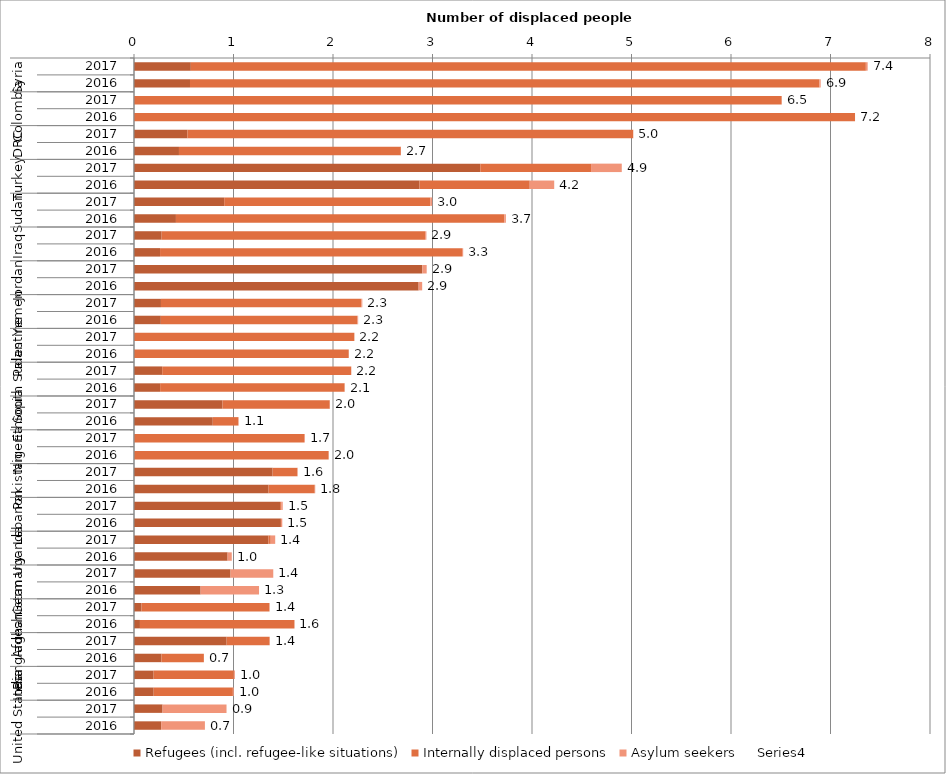
| Category | Refugees (incl. refugee-like situations) | Internally displaced persons | Asylum seekers | Series 3 |
|---|---|---|---|---|
| 0 | 0.571 | 6.784 | 0.018 | 7.373 |
| 1 | 0.563 | 6.326 | 0.012 | 6.901 |
| 2 | 0 | 6.509 | 0.001 | 6.51 |
| 3 | 0 | 7.246 | 0 | 7.247 |
| 4 | 0.537 | 4.48 | 0.001 | 5.018 |
| 5 | 0.452 | 2.23 | 0.001 | 2.683 |
| 6 | 3.48 | 1.113 | 0.309 | 4.902 |
| 7 | 2.869 | 1.108 | 0.246 | 4.223 |
| 8 | 0.907 | 2.072 | 0.018 | 2.997 |
| 9 | 0.421 | 3.3 | 0.016 | 3.737 |
| 10 | 0.278 | 2.648 | 0.013 | 2.939 |
| 11 | 0.262 | 3.035 | 0.011 | 3.308 |
| 12 | 2.898 | 0 | 0.044 | 2.942 |
| 13 | 2.861 | 0 | 0.036 | 2.896 |
| 14 | 0.271 | 2.014 | 0.01 | 2.295 |
| 15 | 0.27 | 1.974 | 0.009 | 2.253 |
| 16 | 0 | 2.215 | 0 | 2.215 |
| 17 | 0 | 2.158 | 0 | 2.158 |
| 18 | 0.283 | 1.899 | 0.002 | 2.184 |
| 19 | 0.263 | 1.854 | 0.002 | 2.118 |
| 20 | 0.889 | 1.078 | 0.003 | 1.97 |
| 21 | 0.792 | 0.258 | 0.002 | 1.052 |
| 22 | 0.002 | 1.707 | 0.009 | 1.718 |
| 23 | 0.001 | 1.955 | 0 | 1.957 |
| 24 | 1.393 | 0.249 | 0.003 | 1.646 |
| 25 | 1.353 | 0.464 | 0.005 | 1.821 |
| 26 | 1.468 | 0.011 | 0.015 | 1.495 |
| 27 | 1.477 | 0 | 0.014 | 1.49 |
| 28 | 1.351 | 0.024 | 0.045 | 1.419 |
| 29 | 0.941 | 0 | 0.042 | 0.983 |
| 30 | 0.97 | 0 | 0.429 | 1.4 |
| 31 | 0.669 | 0 | 0.587 | 1.257 |
| 32 | 0.076 | 1.286 | 0 | 1.362 |
| 33 | 0.06 | 1.553 | 0 | 1.613 |
| 34 | 0.931 | 0.432 | 0 | 1.363 |
| 35 | 0.276 | 0.426 | 0 | 0.702 |
| 36 | 0.197 | 0.806 | 0.011 | 1.014 |
| 37 | 0.198 | 0.796 | 0.009 | 1.003 |
| 38 | 0.287 | 0 | 0.643 | 0.93 |
| 39 | 0.273 | 0 | 0.44 | 0.713 |